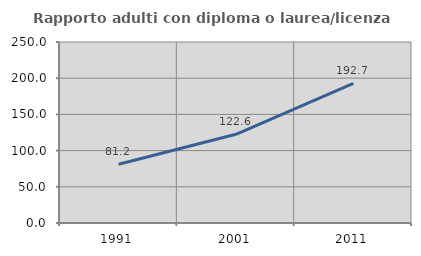
| Category | Rapporto adulti con diploma o laurea/licenza media  |
|---|---|
| 1991.0 | 81.23 |
| 2001.0 | 122.568 |
| 2011.0 | 192.705 |